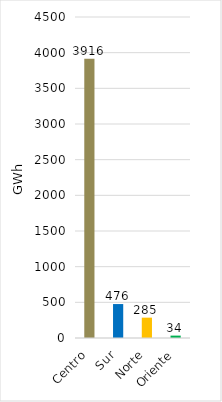
| Category | Series 0 |
|---|---|
| Centro | 3915.585 |
| Sur | 475.851 |
| Norte | 285.18 |
| Oriente | 33.527 |